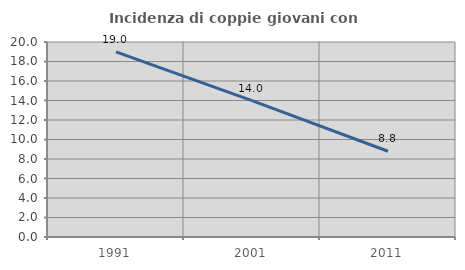
| Category | Incidenza di coppie giovani con figli |
|---|---|
| 1991.0 | 18.995 |
| 2001.0 | 13.987 |
| 2011.0 | 8.794 |